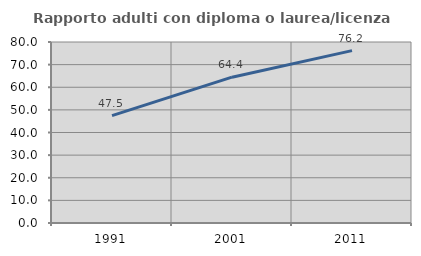
| Category | Rapporto adulti con diploma o laurea/licenza media  |
|---|---|
| 1991.0 | 47.477 |
| 2001.0 | 64.448 |
| 2011.0 | 76.183 |